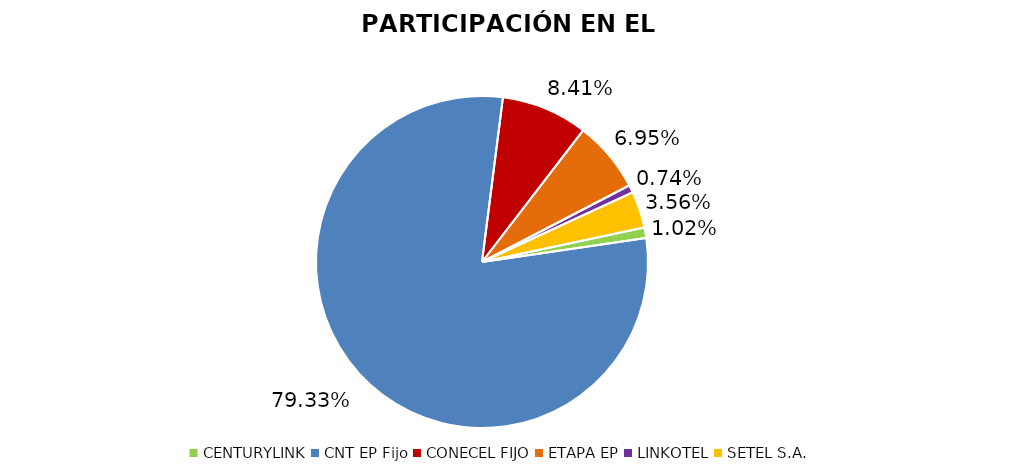
| Category | Participación en el Mercado |
|---|---|
| CENTURYLINK | 0.01 |
| CNT EP Fijo | 0.793 |
| CONECEL FIJO | 0.084 |
| ETAPA EP | 0.069 |
| LINKOTEL | 0.007 |
| SETEL S.A. | 0.036 |